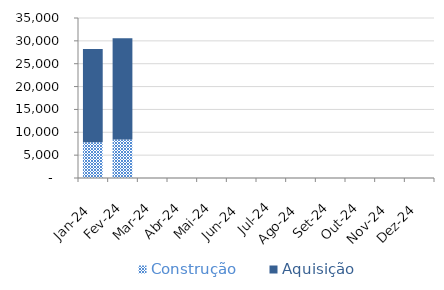
| Category | Construção | Aquisição  |
|---|---|---|
| Jan-24 | 7823 | 20405 |
| Fev-24 | 8448 | 22108 |
| Mar-24 | 0 | 0 |
| Abr-24 | 0 | 0 |
| Mai-24 | 0 | 0 |
| Jun-24 | 0 | 0 |
| Jul-24 | 0 | 0 |
| Ago-24 | 0 | 0 |
| Set-24 | 0 | 0 |
| Out-24 | 0 | 0 |
| Nov-24 | 0 | 0 |
| Dez-24 | 0 | 0 |